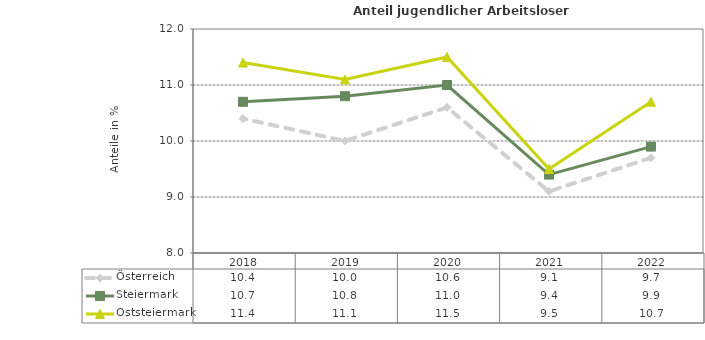
| Category | Österreich | Steiermark | Oststeiermark |
|---|---|---|---|
| 2022.0 | 9.7 | 9.9 | 10.7 |
| 2021.0 | 9.1 | 9.4 | 9.5 |
| 2020.0 | 10.6 | 11 | 11.5 |
| 2019.0 | 10 | 10.8 | 11.1 |
| 2018.0 | 10.4 | 10.7 | 11.4 |